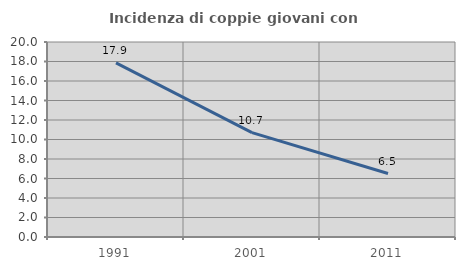
| Category | Incidenza di coppie giovani con figli |
|---|---|
| 1991.0 | 17.867 |
| 2001.0 | 10.705 |
| 2011.0 | 6.509 |